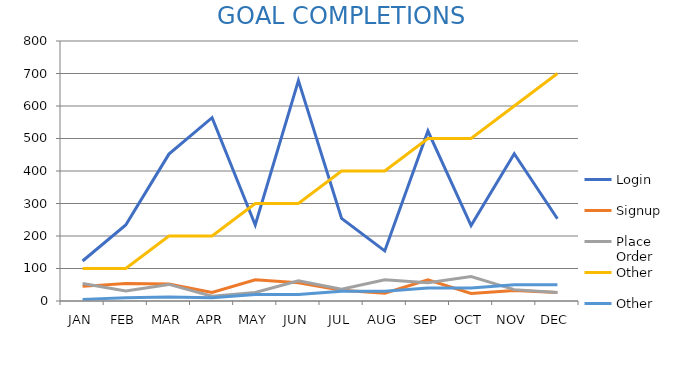
| Category | Login | Signup | Place Order | Other |
|---|---|---|---|---|
| JAN | 123 | 45 | 54 | 5 |
| FEB | 234 | 54 | 31 | 10 |
| MAR | 452 | 52 | 51 | 12 |
| APR | 564 | 26 | 15 | 10 |
| MAY | 234 | 65 | 26 | 20 |
| JUN | 678 | 56 | 62 | 20 |
| JUL | 254 | 33 | 36 | 30 |
| AUG | 154 | 24 | 65 | 30 |
| SEP | 523 | 65 | 56 | 40 |
| OCT | 232 | 23 | 75 | 40 |
| NOV | 453 | 32 | 35 | 50 |
| DEC | 253 | 26 | 26 | 50 |